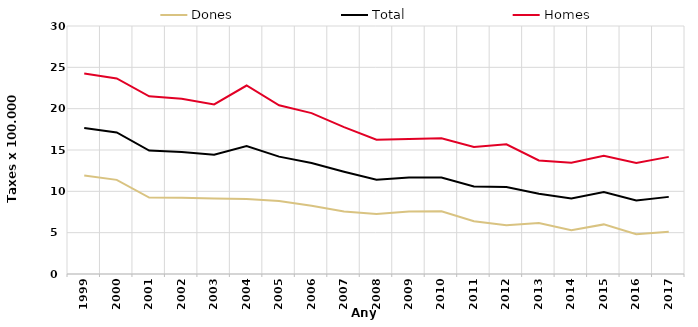
| Category | Dones | Total | Homes |
|---|---|---|---|
| 1999.0 | 11.92 | 17.66 | 24.26 |
| 2000.0 | 11.39 | 17.12 | 23.65 |
| 2001.0 | 9.25 | 14.93 | 21.5 |
| 2002.0 | 9.23 | 14.77 | 21.19 |
| 2003.0 | 9.12 | 14.44 | 20.52 |
| 2004.0 | 9.07 | 15.47 | 22.8 |
| 2005.0 | 8.84 | 14.2 | 20.41 |
| 2006.0 | 8.25 | 13.43 | 19.46 |
| 2007.0 | 7.57 | 12.37 | 17.77 |
| 2008.0 | 7.26 | 11.4 | 16.25 |
| 2009.0 | 7.56 | 11.67 | 16.32 |
| 2010.0 | 7.59 | 11.68 | 16.41 |
| 2011.0 | 6.38 | 10.58 | 15.36 |
| 2012.0 | 5.91 | 10.52 | 15.69 |
| 2013.0 | 6.18 | 9.71 | 13.74 |
| 2014.0 | 5.29 | 9.13 | 13.47 |
| 2015.0 | 6 | 9.91 | 14.29 |
| 2016.0 | 4.8 | 8.89 | 13.43 |
| 2017.0 | 5.1 | 9.33 | 14.17 |